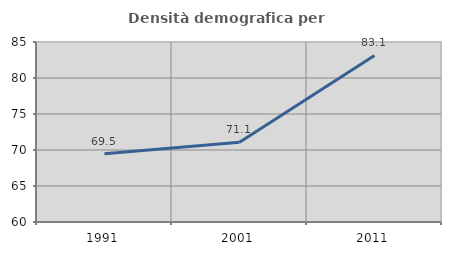
| Category | Densità demografica |
|---|---|
| 1991.0 | 69.494 |
| 2001.0 | 71.077 |
| 2011.0 | 83.128 |